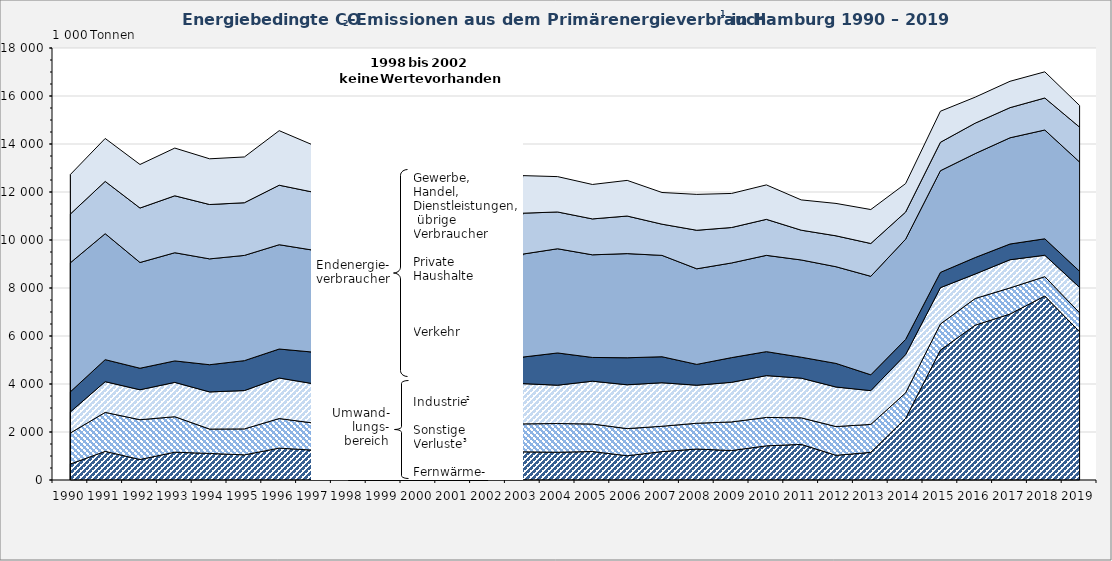
| Category | Stromerzeugung | Fernwärmeerzeugung | Sonstige Verluste2 | Gewinnung von Steinen und Erden, sonst. Bergbau, Verarbeitendes Gewerbe | Verkehr | Private Haushalte | Gewerbe, Handel, Dienstleistungen, 
übrige Verbraucher |
|---|---|---|---|---|---|---|---|
| 1990.0 | 667.234 | 1293.056 | 878.022 | 838.375 | 5376.032 | 2031.727 | 1645.735 |
| 1991.0 | 1192.495 | 1625.018 | 1279.399 | 917.622 | 5248.049 | 2178.22 | 1789.799 |
| 1992.0 | 853.721 | 1657.837 | 1248.869 | 896.097 | 4406.531 | 2269.573 | 1814.376 |
| 1993.0 | 1158.684 | 1478.514 | 1430.467 | 893.979 | 4507.948 | 2372.24 | 1988.483 |
| 1994.0 | 1106.375 | 1015.464 | 1548.45 | 1133.267 | 4409.767 | 2265.053 | 1904.575 |
| 1995.0 | 1048.124 | 1080.494 | 1597.956 | 1246.689 | 4384.807 | 2195.159 | 1906.947 |
| 1996.0 | 1328.047 | 1232.962 | 1689.083 | 1207.184 | 4346.529 | 2479.059 | 2272.769 |
| 1997.0 | 1241.945 | 1128.016 | 1636.466 | 1318.545 | 4245.179 | 2416.079 | 1952.26 |
| 1998.0 | 0 | 0 | 0 | 0 | 0 | 0 | 0 |
| 1999.0 | 0 | 0 | 0 | 0 | 0 | 0 | 0 |
| 2000.0 | 0 | 0 | 0 | 0 | 0 | 0 | 0 |
| 2001.0 | 0 | 0 | 0 | 0 | 0 | 0 | 0 |
| 2002.0 | 0 | 0 | 0 | 0 | 0 | 0 | 0 |
| 2003.0 | 1173.28 | 1165.155 | 1677.45 | 1105.942 | 4290.451 | 1705.148 | 1565.068 |
| 2004.0 | 1155.991 | 1197.455 | 1596.465 | 1343.69 | 4341.193 | 1533.008 | 1473.155 |
| 2005.0 | 1186.639 | 1146.306 | 1784.1 | 989.577 | 4275.655 | 1496.285 | 1434.78 |
| 2006.0 | 1010.943 | 1130.721 | 1825.824 | 1125.719 | 4339.213 | 1565.88 | 1485.8 |
| 2007.0 | 1183.43 | 1056.389 | 1812.278 | 1083.927 | 4222.839 | 1300.327 | 1320.2 |
| 2008.0 | 1289.998 | 1074.775 | 1584.577 | 868.288 | 3982.22 | 1605.323 | 1495.816 |
| 2009.0 | 1227.625 | 1192.26 | 1651.064 | 1028.45 | 3944.076 | 1476.988 | 1419.579 |
| 2010.0 | 1422.675 | 1184.203 | 1742.911 | 998.496 | 4011.484 | 1500.813 | 1435.056 |
| 2011.0 | 1484.694 | 1105.401 | 1653.977 | 871.981 | 4052.288 | 1241.124 | 1261.111 |
| 2012.0 | 1028.555 | 1199.078 | 1646.821 | 983.326 | 4028.454 | 1288.044 | 1349.33 |
| 2013.0 | 1151.439 | 1165.007 | 1407.191 | 659.862 | 4104.059 | 1366.337 | 1415.203 |
| 2014.0 | 2566.361 | 1064.57 | 1591.964 | 632.802 | 4177.052 | 1130.672 | 1186.634 |
| 2015.0 | 5412.217 | 1087.529 | 1513.915 | 636.702 | 4236.111 | 1184.332 | 1294.08 |
| 2016.0 | 6451.487 | 1111.208 | 1020.551 | 686.129 | 4331.486 | 1267.551 | 1082.96 |
| 2017.0 | 6914.235 | 1089.285 | 1174.077 | 655.086 | 4426.365 | 1255.872 | 1098.01 |
| 2018.0 | 7667.019 | 804.963 | 892.873 | 685.889 | 4532.579 | 1333.464 | 1090.672 |
| 2019.0 | 6176.21 | 791.526 | 1057.344 | 670.932 | 4554.332 | 1452.074 | 900 |